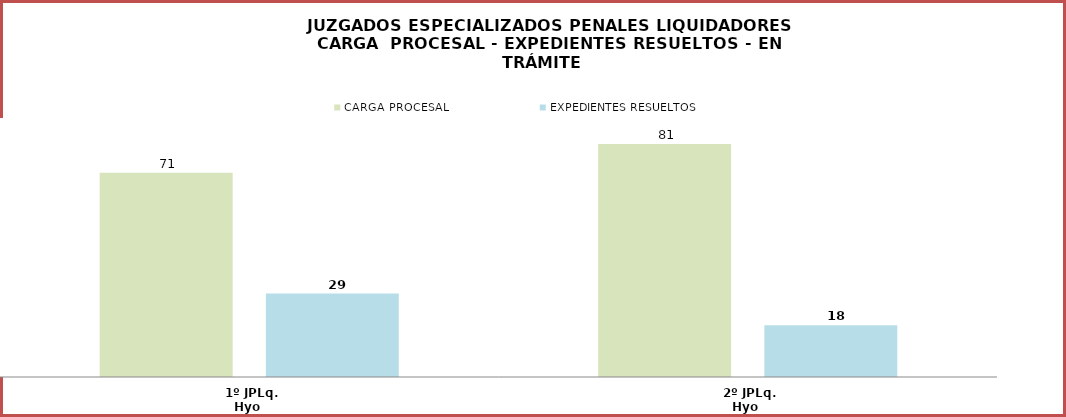
| Category | CARGA PROCESAL | EXPEDIENTES RESUELTOS |
|---|---|---|
| 1º JPLq. Hyo | 71 | 29 |
| 2º JPLq. Hyo | 81 | 18 |